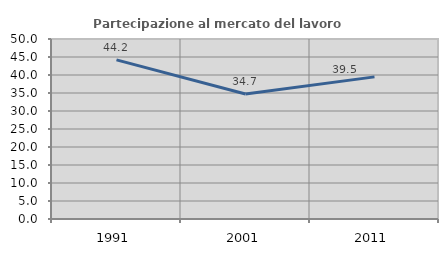
| Category | Partecipazione al mercato del lavoro  femminile |
|---|---|
| 1991.0 | 44.204 |
| 2001.0 | 34.709 |
| 2011.0 | 39.482 |